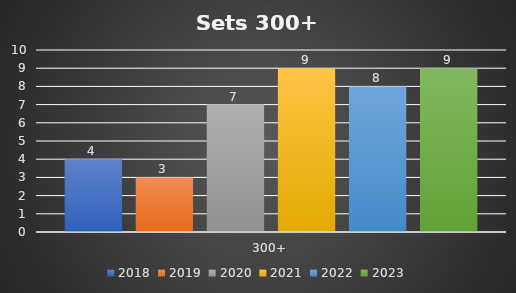
| Category | 2018 | 2019 | 2020 | 2021 | 2022 | 2023 |
|---|---|---|---|---|---|---|
| 300+ | 4 | 3 | 7 | 9 | 8 | 9 |